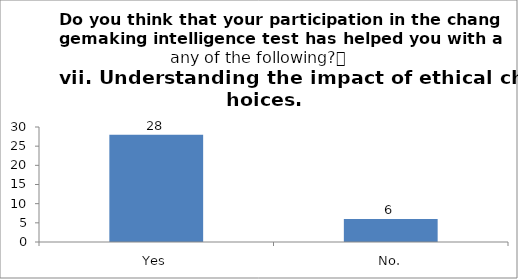
| Category | Do you think that your participation in the changemaking intelligence test has helped you with any of the following?
vii. Understanding the impact of ethical choices. |
|---|---|
| Yes | 28 |
| No. | 6 |